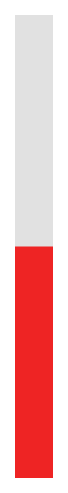
| Category | Series 0 | Series 1 |
|---|---|---|
| 0 | 1 | 0.5 |